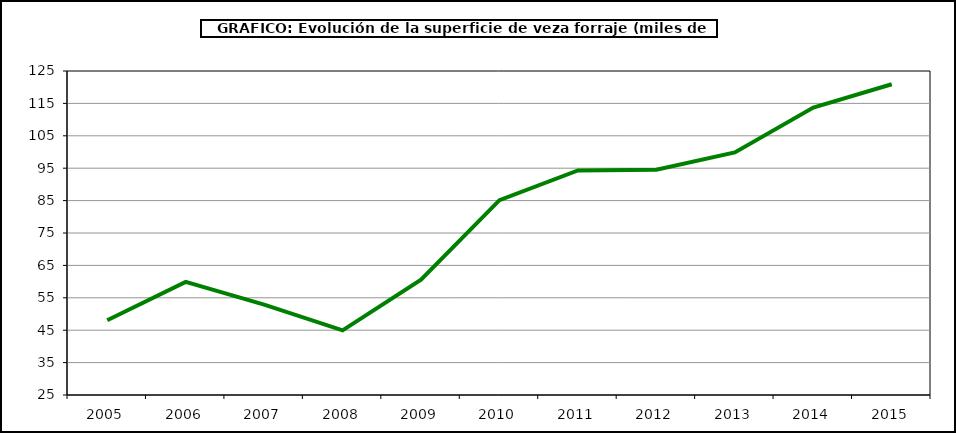
| Category | Superficie |
|---|---|
| 2005.0 | 48.086 |
| 2006.0 | 59.927 |
| 2007.0 | 52.887 |
| 2008.0 | 44.94 |
| 2009.0 | 60.618 |
| 2010.0 | 85.154 |
| 2011.0 | 94.325 |
| 2012.0 | 94.499 |
| 2013.0 | 99.877 |
| 2014.0 | 113.725 |
| 2015.0 | 120.903 |